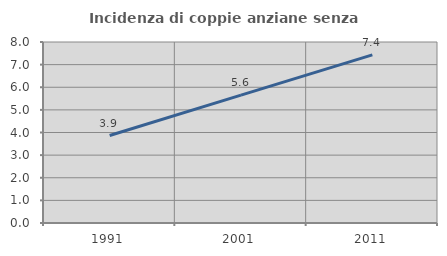
| Category | Incidenza di coppie anziane senza figli  |
|---|---|
| 1991.0 | 3.867 |
| 2001.0 | 5.65 |
| 2011.0 | 7.43 |